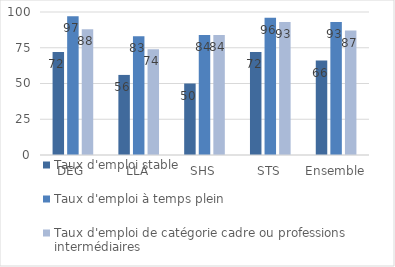
| Category | Taux d'emploi stable | Taux d'emploi à temps plein | Taux d'emploi de catégorie cadre ou professions intermédiaires |
|---|---|---|---|
| DEG | 72 | 97 | 88 |
| LLA | 56 | 83 | 74 |
| SHS | 50 | 84 | 84 |
| STS | 72 | 96 | 93 |
| Ensemble | 66 | 93 | 87 |